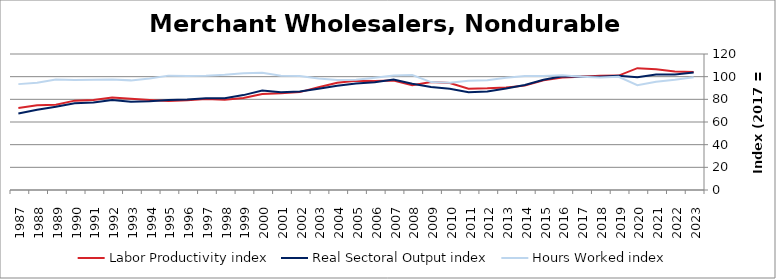
| Category | Labor Productivity index | Real Sectoral Output index | Hours Worked index |
|---|---|---|---|
| 2023.0 | 104.084 | 103.594 | 99.53 |
| 2022.0 | 104.663 | 101.915 | 97.374 |
| 2021.0 | 106.529 | 101.839 | 95.598 |
| 2020.0 | 107.481 | 99.386 | 92.469 |
| 2019.0 | 100.927 | 100.872 | 99.945 |
| 2018.0 | 100.723 | 99.903 | 99.187 |
| 2017.0 | 100 | 100 | 100 |
| 2016.0 | 99.168 | 100.381 | 101.223 |
| 2015.0 | 96.755 | 97.238 | 100.499 |
| 2014.0 | 92.087 | 92.594 | 100.551 |
| 2013.0 | 90.371 | 89.466 | 98.999 |
| 2012.0 | 89.704 | 86.914 | 96.89 |
| 2011.0 | 89.433 | 86.285 | 96.479 |
| 2010.0 | 94.364 | 89.343 | 94.68 |
| 2009.0 | 95.34 | 90.792 | 95.23 |
| 2008.0 | 92.344 | 93.69 | 101.457 |
| 2007.0 | 96.529 | 97.561 | 101.069 |
| 2006.0 | 96.088 | 95.16 | 99.034 |
| 2005.0 | 96.459 | 93.905 | 97.352 |
| 2004.0 | 94.647 | 91.925 | 97.124 |
| 2003.0 | 90.683 | 89.31 | 98.487 |
| 2002.0 | 86.38 | 86.837 | 100.529 |
| 2001.0 | 85.388 | 86.166 | 100.912 |
| 2000.0 | 84.685 | 87.693 | 103.552 |
| 1999.0 | 81.239 | 83.737 | 103.075 |
| 1998.0 | 79.609 | 81.017 | 101.769 |
| 1997.0 | 80.349 | 81.019 | 100.834 |
| 1996.0 | 79.258 | 79.785 | 100.665 |
| 1995.0 | 78.591 | 79.308 | 100.913 |
| 1994.0 | 79.444 | 78.21 | 98.447 |
| 1993.0 | 80.549 | 77.915 | 96.729 |
| 1992.0 | 81.541 | 79.473 | 97.465 |
| 1991.0 | 79.379 | 77.155 | 97.199 |
| 1990.0 | 78.852 | 76.578 | 97.116 |
| 1989.0 | 75.267 | 73.426 | 97.553 |
| 1988.0 | 74.778 | 70.811 | 94.695 |
| 1987.0 | 72.35 | 67.587 | 93.417 |